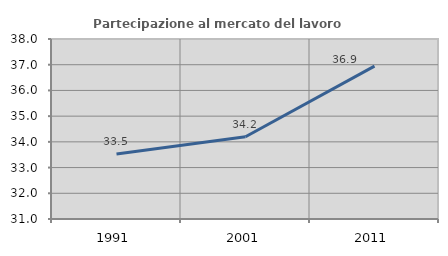
| Category | Partecipazione al mercato del lavoro  femminile |
|---|---|
| 1991.0 | 33.53 |
| 2001.0 | 34.199 |
| 2011.0 | 36.946 |